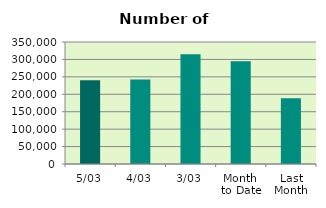
| Category | Series 0 |
|---|---|
| 5/03 | 240442 |
| 4/03 | 242542 |
| 3/03 | 314820 |
| Month 
to Date | 294572 |
| Last
Month | 188783.7 |